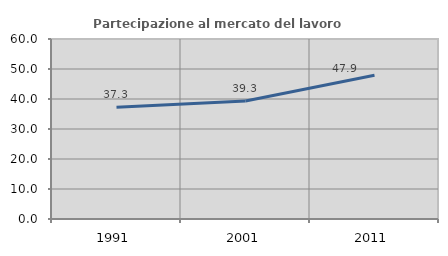
| Category | Partecipazione al mercato del lavoro  femminile |
|---|---|
| 1991.0 | 37.276 |
| 2001.0 | 39.344 |
| 2011.0 | 47.945 |